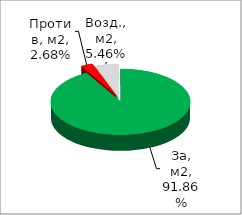
| Category | Series 0 |
|---|---|
| За, м2 | 0.919 |
| Против, м2 | 0.027 |
| Возд., м2 | 0.055 |